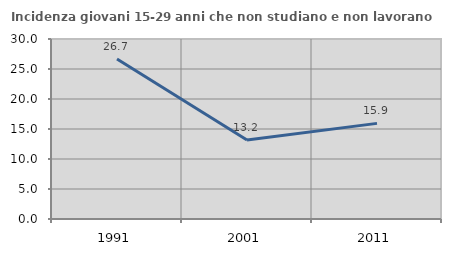
| Category | Incidenza giovani 15-29 anni che non studiano e non lavorano  |
|---|---|
| 1991.0 | 26.667 |
| 2001.0 | 13.163 |
| 2011.0 | 15.939 |